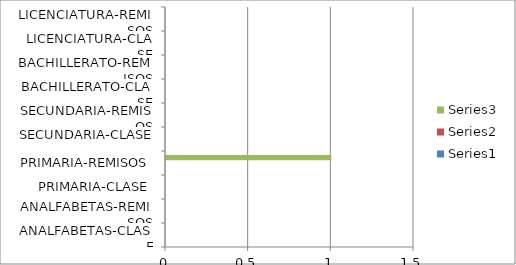
| Category | Series 0 | Series 1 | Series 2 |
|---|---|---|---|
| ANALFABETAS-CLASE |  |  | 0 |
| ANALFABETAS-REMISOS |  |  | 0 |
| PRIMARIA-CLASE |  |  | 0 |
| PRIMARIA-REMISOS |  |  | 1 |
| SECUNDARIA-CLASE |  |  | 0 |
| SECUNDARIA-REMISOS |  |  | 0 |
| BACHILLERATO-CLASE |  |  | 0 |
| BACHILLERATO-REMISOS |  |  | 0 |
| LICENCIATURA-CLASE |  |  | 0 |
| LICENCIATURA-REMISOS |  |  | 0 |